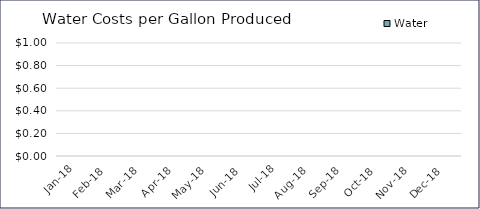
| Category | Water |
|---|---|
| 2018-01-01 | 0 |
| 2018-02-01 | 0 |
| 2018-03-01 | 0 |
| 2018-04-01 | 0 |
| 2018-05-01 | 0 |
| 2018-06-01 | 0 |
| 2018-07-01 | 0 |
| 2018-08-01 | 0 |
| 2018-09-01 | 0 |
| 2018-10-01 | 0 |
| 2018-11-01 | 0 |
| 2018-12-01 | 0 |